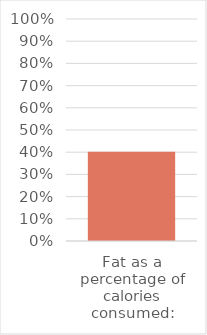
| Category | Series 0 |
|---|---|
| Fat as a percentage of calories consumed: | 0.402 |